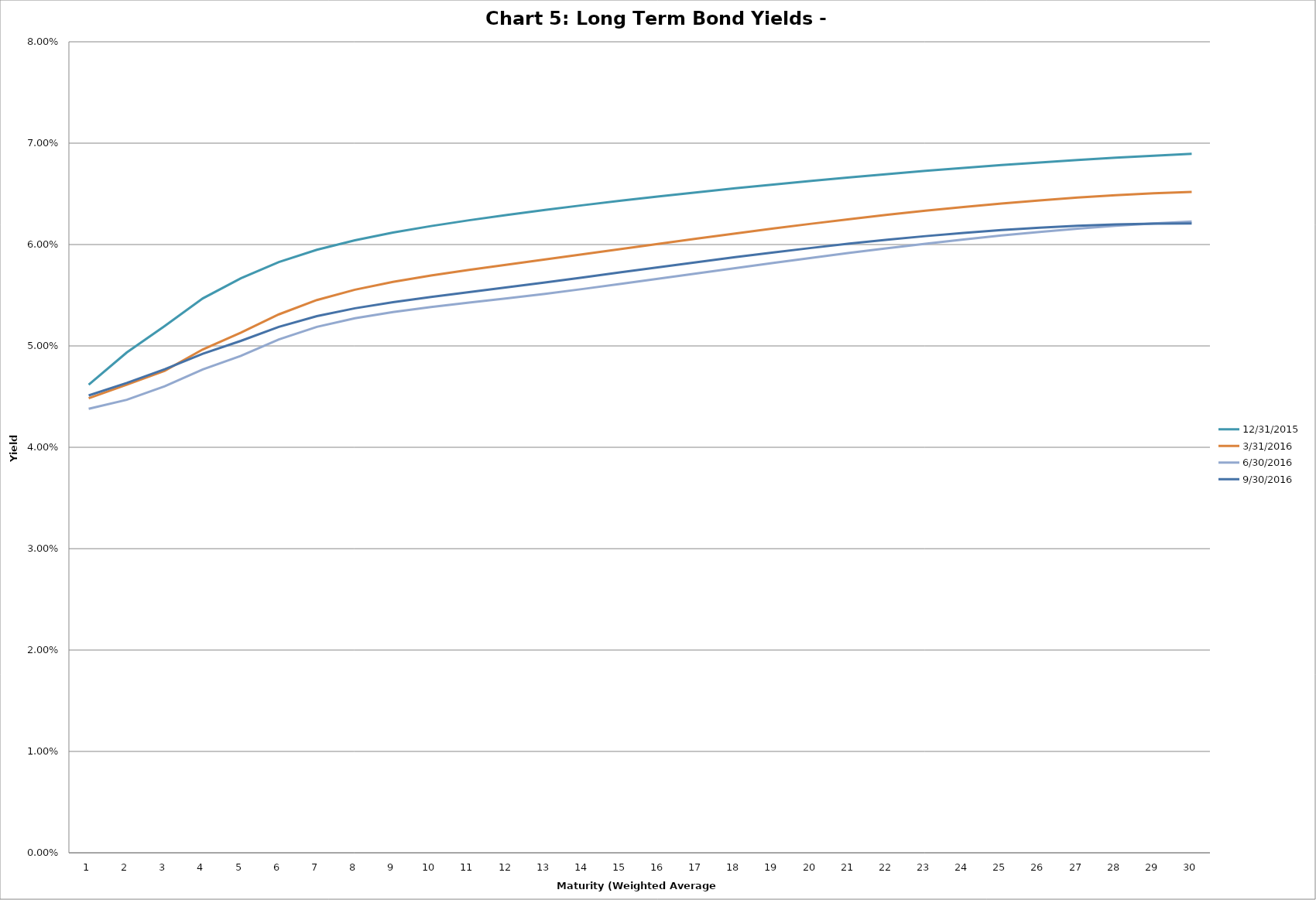
| Category | 12/31/2015 | 3/31/2016 | 6/30/2016 | 9/30/2016 |
|---|---|---|---|---|
| 0 | 0.046 | 0.045 | 0.044 | 0.045 |
| 1 | 0.049 | 0.046 | 0.045 | 0.046 |
| 2 | 0.052 | 0.048 | 0.046 | 0.048 |
| 3 | 0.055 | 0.05 | 0.048 | 0.049 |
| 4 | 0.057 | 0.051 | 0.049 | 0.05 |
| 5 | 0.058 | 0.053 | 0.051 | 0.052 |
| 6 | 0.059 | 0.055 | 0.052 | 0.053 |
| 7 | 0.06 | 0.056 | 0.053 | 0.054 |
| 8 | 0.061 | 0.056 | 0.053 | 0.054 |
| 9 | 0.062 | 0.057 | 0.054 | 0.055 |
| 10 | 0.062 | 0.057 | 0.054 | 0.055 |
| 11 | 0.063 | 0.058 | 0.055 | 0.056 |
| 12 | 0.063 | 0.059 | 0.055 | 0.056 |
| 13 | 0.064 | 0.059 | 0.056 | 0.057 |
| 14 | 0.064 | 0.06 | 0.056 | 0.057 |
| 15 | 0.065 | 0.06 | 0.057 | 0.058 |
| 16 | 0.065 | 0.061 | 0.057 | 0.058 |
| 17 | 0.066 | 0.061 | 0.058 | 0.059 |
| 18 | 0.066 | 0.062 | 0.058 | 0.059 |
| 19 | 0.066 | 0.062 | 0.059 | 0.06 |
| 20 | 0.067 | 0.063 | 0.059 | 0.06 |
| 21 | 0.067 | 0.063 | 0.06 | 0.06 |
| 22 | 0.067 | 0.063 | 0.06 | 0.061 |
| 23 | 0.068 | 0.064 | 0.061 | 0.061 |
| 24 | 0.068 | 0.064 | 0.061 | 0.061 |
| 25 | 0.068 | 0.064 | 0.061 | 0.062 |
| 26 | 0.068 | 0.065 | 0.062 | 0.062 |
| 27 | 0.069 | 0.065 | 0.062 | 0.062 |
| 28 | 0.069 | 0.065 | 0.062 | 0.062 |
| 29 | 0.069 | 0.065 | 0.062 | 0.062 |